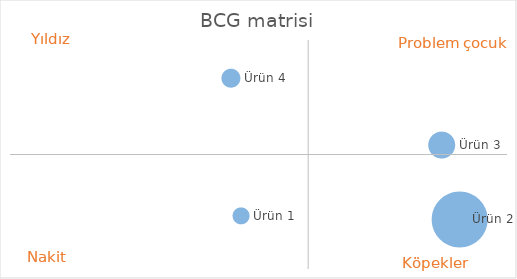
| Category | Series 0 |
|---|---|
| 0.46428571428571425 | 0.08 |
| 0.9047619047619048 | 0.06 |
| 0.868421052631579 | 0.45 |
| 0.4444444444444445 | 0.8 |